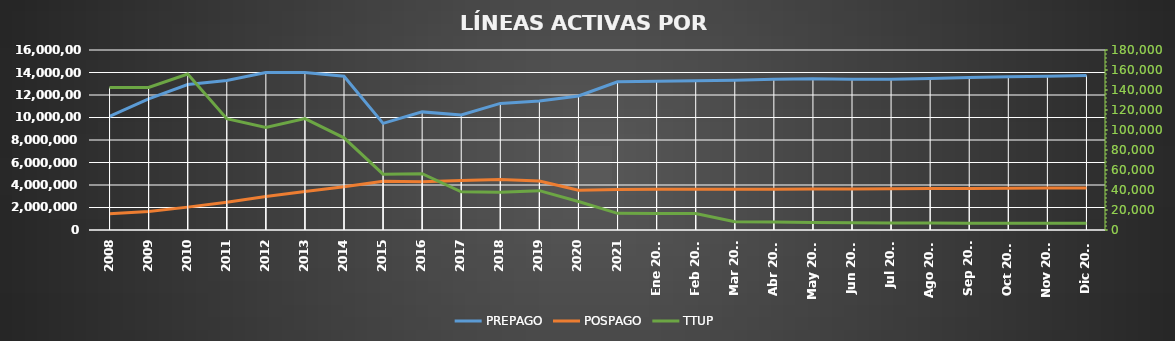
| Category | PREPAGO | POSPAGO |
|---|---|---|
| 2008 | 10097768 | 1452088 |
| 2009 | 11662294 | 1649838 |
| 2010 | 12929040 | 2033814 |
| 2011 | 13295834 | 2467378 |
| 2012 | 14008104 | 2976194 |
| 2013 | 14005126 | 3425277 |
| 2014 | 13666071 | 3846271 |
| 2015 | 9476240 | 4326937 |
| 2016 | 10498467 | 4293426 |
| 2017 | 10219457 | 4393703 |
| 2018 | 11254168 | 4480975 |
| 2019 | 11462048 | 4351686 |
| 2020 | 11917697 | 3539192 |
| 2021 | 13174530 | 3598383 |
| Ene 2022 | 13220510 | 3611202 |
| Feb 2022 | 13277237 | 3612124 |
| Mar 2022 | 13319621 | 3621700 |
| Abr 2022 | 13391496 | 3628201 |
| May 2022 | 13434704 | 3642700 |
| Jun 2022 | 13396249 | 3652440 |
| Jul 2022 | 13410009 | 3668962 |
| Ago 2022 | 13466342 | 3682408 |
| Sep 2022 | 13550174 | 3696591 |
| Oct 2022 | 13621140 | 3709853 |
| Nov 2022 | 13659038 | 3726103 |
| Dic 2022 | 13740159 | 3743849 |